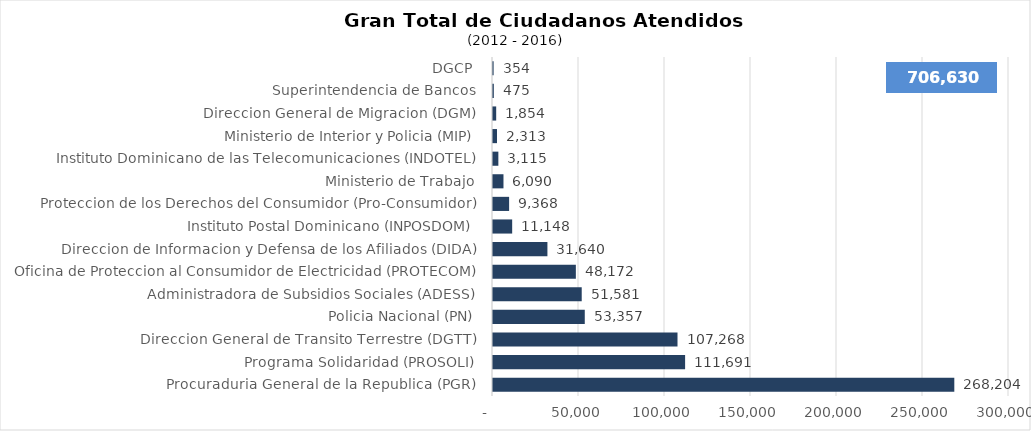
| Category | Series 0 |
|---|---|
| Procuraduria General de la Republica (PGR) | 268204 |
| Programa Solidaridad (PROSOLI) | 111691 |
| Direccion General de Transito Terrestre (DGTT) | 107268 |
| Policia Nacional (PN) | 53357 |
| Administradora de Subsidios Sociales (ADESS) | 51581 |
| Oficina de Proteccion al Consumidor de Electricidad (PROTECOM) | 48172 |
| Direccion de Informacion y Defensa de los Afiliados (DIDA) | 31640 |
| Instituto Postal Dominicano (INPOSDOM) | 11148 |
| Proteccion de los Derechos del Consumidor (Pro-Consumidor) | 9368 |
| Ministerio de Trabajo | 6090 |
| Instituto Dominicano de las Telecomunicaciones (INDOTEL) | 3115 |
| Ministerio de Interior y Policia (MIP) | 2313 |
| Direccion General de Migracion (DGM) | 1854 |
| Superintendencia de Bancos | 475 |
| DGCP | 354 |